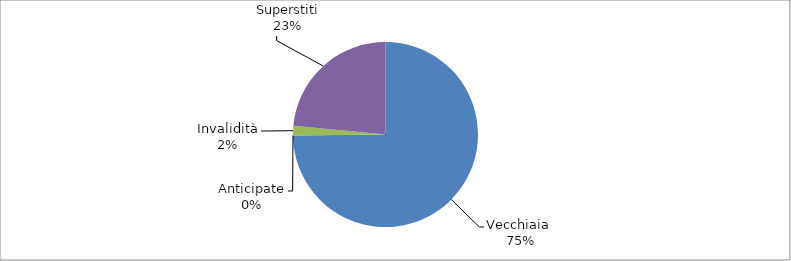
| Category | Series 0 |
|---|---|
| Vecchiaia  | 8234 |
| Anticipate | 0 |
| Invalidità | 186 |
| Superstiti | 2586 |